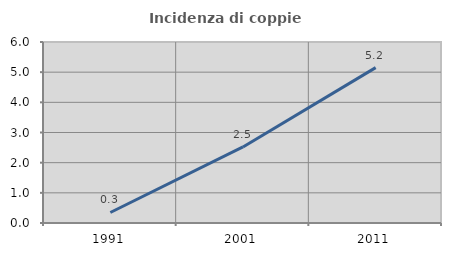
| Category | Incidenza di coppie miste |
|---|---|
| 1991.0 | 0.348 |
| 2001.0 | 2.521 |
| 2011.0 | 5.151 |